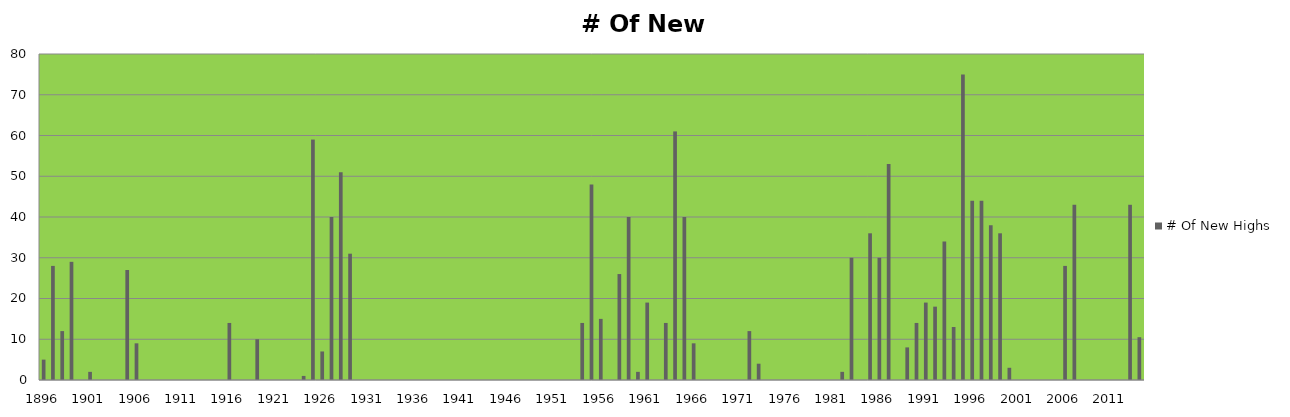
| Category | # Of New Highs |
|---|---|
| 1896.0 | 5 |
| 1897.0 | 28 |
| 1898.0 | 12 |
| 1899.0 | 29 |
| 1900.0 | 0 |
| 1901.0 | 2 |
| 1902.0 | 0 |
| 1903.0 | 0 |
| 1904.0 | 0 |
| 1905.0 | 27 |
| 1906.0 | 9 |
| 1907.0 | 0 |
| 1908.0 | 0 |
| 1909.0 | 0 |
| 1910.0 | 0 |
| 1911.0 | 0 |
| 1912.0 | 0 |
| 1913.0 | 0 |
| 1914.0 | 0 |
| 1915.0 | 0 |
| 1916.0 | 14 |
| 1917.0 | 0 |
| 1918.0 | 0 |
| 1919.0 | 10 |
| 1920.0 | 0 |
| 1921.0 | 0 |
| 1922.0 | 0 |
| 1923.0 | 0 |
| 1924.0 | 1 |
| 1925.0 | 59 |
| 1926.0 | 7 |
| 1927.0 | 40 |
| 1928.0 | 51 |
| 1929.0 | 31 |
| 1930.0 | 0 |
| 1931.0 | 0 |
| 1932.0 | 0 |
| 1933.0 | 0 |
| 1934.0 | 0 |
| 1935.0 | 0 |
| 1936.0 | 0 |
| 1937.0 | 0 |
| 1938.0 | 0 |
| 1939.0 | 0 |
| 1940.0 | 0 |
| 1941.0 | 0 |
| 1942.0 | 0 |
| 1943.0 | 0 |
| 1944.0 | 0 |
| 1945.0 | 0 |
| 1946.0 | 0 |
| 1947.0 | 0 |
| 1948.0 | 0 |
| 1949.0 | 0 |
| 1950.0 | 0 |
| 1951.0 | 0 |
| 1952.0 | 0 |
| 1953.0 | 0 |
| 1954.0 | 14 |
| 1955.0 | 48 |
| 1956.0 | 15 |
| 1957.0 | 0 |
| 1958.0 | 26 |
| 1959.0 | 40 |
| 1960.0 | 2 |
| 1961.0 | 19 |
| 1962.0 | 0 |
| 1963.0 | 14 |
| 1964.0 | 61 |
| 1965.0 | 40 |
| 1966.0 | 9 |
| 1967.0 | 0 |
| 1968.0 | 0 |
| 1969.0 | 0 |
| 1970.0 | 0 |
| 1971.0 | 0 |
| 1972.0 | 12 |
| 1973.0 | 4 |
| 1974.0 | 0 |
| 1975.0 | 0 |
| 1976.0 | 0 |
| 1977.0 | 0 |
| 1978.0 | 0 |
| 1979.0 | 0 |
| 1980.0 | 0 |
| 1981.0 | 0 |
| 1982.0 | 2 |
| 1983.0 | 30 |
| 1984.0 | 0 |
| 1985.0 | 36 |
| 1986.0 | 30 |
| 1987.0 | 53 |
| 1988.0 | 0 |
| 1989.0 | 8 |
| 1990.0 | 14 |
| 1991.0 | 19 |
| 1992.0 | 18 |
| 1993.0 | 34 |
| 1994.0 | 13 |
| 1995.0 | 75 |
| 1996.0 | 44 |
| 1997.0 | 44 |
| 1998.0 | 38 |
| 1999.0 | 36 |
| 2000.0 | 3 |
| 2001.0 | 0 |
| 2002.0 | 0 |
| 2003.0 | 0 |
| 2004.0 | 0 |
| 2005.0 | 0 |
| 2006.0 | 28 |
| 2007.0 | 43 |
| 2008.0 | 0 |
| 2009.0 | 0 |
| 2010.0 | 0 |
| 2011.0 | 0 |
| 2012.0 | 0 |
| 2013.0 | 43 |
| nan | 10.508 |